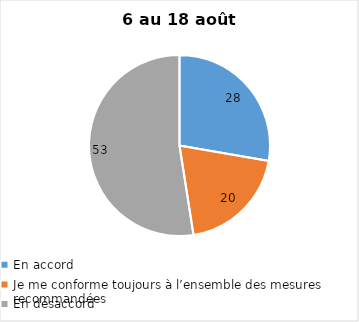
| Category | Series 0 |
|---|---|
| En accord | 28 |
| Je me conforme toujours à l’ensemble des mesures recommandées | 20 |
| En désaccord | 53 |